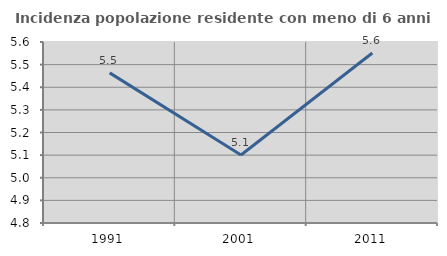
| Category | Incidenza popolazione residente con meno di 6 anni |
|---|---|
| 1991.0 | 5.464 |
| 2001.0 | 5.101 |
| 2011.0 | 5.551 |